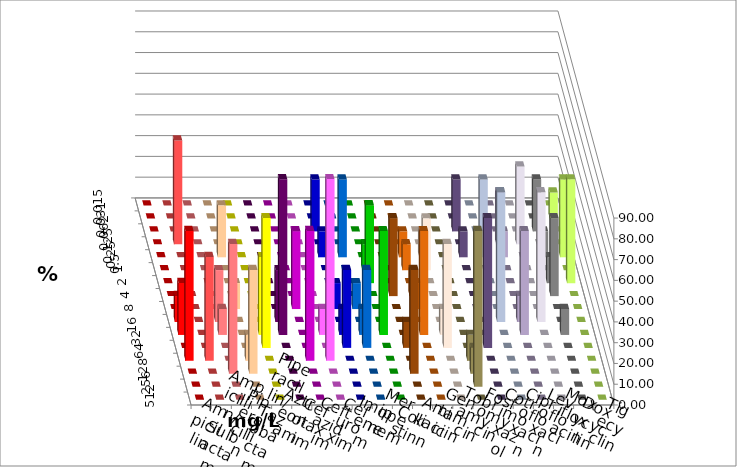
| Category | Ampicillin | Ampicillin/ Sulbactam | Piperacillin | Piperacillin/ Tazobactam | Aztreonam | Cefotaxim | Ceftazidim | Cefuroxim | Imipenem | Meropenem | Colistin | Amikacin | Gentamicin | Tobramycin | Fosfomycin | Cotrimoxazol | Ciprofloxacin | Levofloxacin | Moxifloxacin | Doxycyclin | Tigecyclin |
|---|---|---|---|---|---|---|---|---|---|---|---|---|---|---|---|---|---|---|---|---|---|
| 0.015 | 0 | 0 | 0 | 0 | 0 | 0 | 0 | 0 | 0 | 0 | 0 | 0 | 0 | 0 | 0 | 0 | 0 | 0 | 0 | 0 | 0 |
| 0.031 | 0 | 0 | 0 | 0 | 0 | 0 | 0 | 0 | 0 | 0 | 0 | 0 | 0 | 0 | 0 | 0 | 0 | 0 | 0 | 0 | 12.5 |
| 0.062 | 0 | 0 | 0 | 0 | 0 | 0 | 0 | 0 | 25 | 0 | 0 | 0 | 0 | 0 | 0 | 25 | 0 | 0 | 0 | 25 | 0 |
| 0.125 | 0 | 50 | 0 | 0 | 0 | 0 | 0 | 0 | 0 | 0 | 0 | 0 | 0 | 0 | 0 | 0 | 0 | 25 | 37.5 | 0 | 0 |
| 0.25 | 0 | 0 | 0 | 25 | 0 | 0 | 0 | 0 | 12.5 | 37.5 | 0 | 0 | 12.5 | 12.5 | 0 | 12.5 | 37.5 | 12.5 | 0 | 12.5 | 37.5 |
| 0.5 | 0 | 0 | 0 | 0 | 0 | 0 | 0 | 0 | 0 | 0 | 12.5 | 0 | 12.5 | 25 | 0 | 0 | 0 | 0 | 0 | 0 | 0 |
| 1.0 | 0 | 0 | 0 | 0 | 0 | 0 | 0 | 0 | 0 | 0 | 37.5 | 0 | 0 | 0 | 0 | 0 | 0 | 0 | 0 | 12.5 | 50 |
| 2.0 | 0 | 0 | 0 | 0 | 0 | 0 | 0 | 0 | 0 | 0 | 0 | 37.5 | 12.5 | 0 | 0 | 0 | 0 | 0 | 0 | 37.5 | 0 |
| 4.0 | 0 | 0 | 0 | 12.5 | 0 | 0 | 37.5 | 0 | 12.5 | 12.5 | 0 | 0 | 12.5 | 0 | 0 | 0 | 0 | 0 | 0 | 0 | 0 |
| 8.0 | 12.5 | 0 | 25 | 0 | 0 | 25 | 0 | 0 | 0 | 0 | 0 | 0 | 0 | 0 | 0 | 0 | 62.5 | 12.5 | 62.5 | 0 | 0 |
| 16.0 | 25 | 0 | 12.5 | 0 | 37.5 | 75 | 0 | 12.5 | 12.5 | 12.5 | 50 | 0 | 50 | 12.5 | 0 | 0 | 0 | 50 | 0 | 12.5 | 0 |
| 32.0 | 0 | 0 | 0 | 0 | 62.5 | 0 | 0 | 0 | 37.5 | 37.5 | 0 | 12.5 | 0 | 50 | 0 | 62.5 | 0 | 0 | 0 | 0 | 0 |
| 64.0 | 62.5 | 50 | 0 | 12.5 | 0 | 0 | 62.5 | 87.5 | 0 | 0 | 0 | 0 | 0 | 0 | 12.5 | 0 | 0 | 0 | 0 | 0 | 0 |
| 128.0 | 0 | 0 | 62.5 | 50 | 0 | 0 | 0 | 0 | 0 | 0 | 0 | 50 | 0 | 0 | 12.5 | 0 | 0 | 0 | 0 | 0 | 0 |
| 256.0 | 0 | 0 | 0 | 0 | 0 | 0 | 0 | 0 | 0 | 0 | 0 | 0 | 0 | 0 | 75 | 0 | 0 | 0 | 0 | 0 | 0 |
| 512.0 | 0 | 0 | 0 | 0 | 0 | 0 | 0 | 0 | 0 | 0 | 0 | 0 | 0 | 0 | 0 | 0 | 0 | 0 | 0 | 0 | 0 |